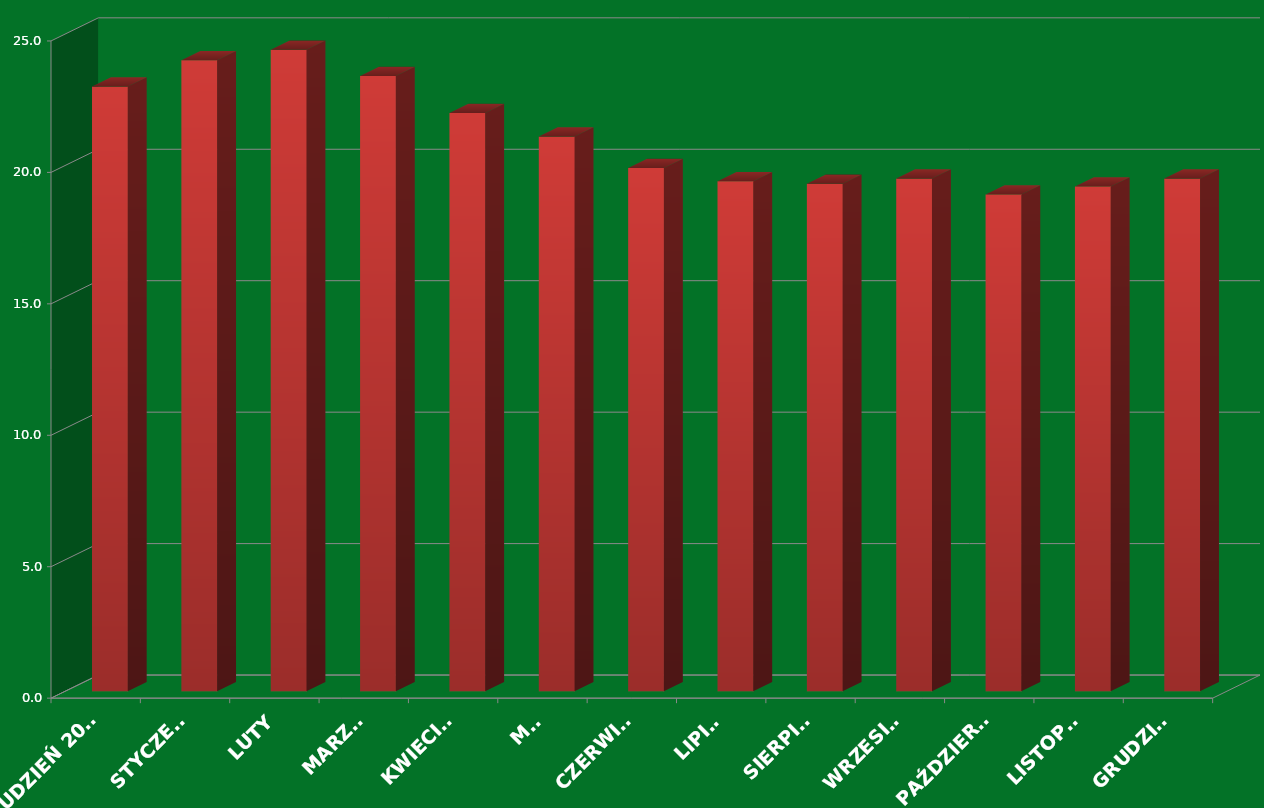
| Category | Series 0 |
|---|---|
| GRUDZIEŃ 2013 | 23 |
| STYCZEŃ | 24 |
| LUTY | 24.4 |
| MARZEC | 23.4 |
| KWIECIEŃ | 22 |
| MAJ | 21.1 |
| CZERWIEC | 19.9 |
| LIPIEC | 19.4 |
| SIERPIEŃ | 19.3 |
| WRZESIEŃ | 19.5 |
| PAŹDZIERNIK | 18.9 |
| LISTOPAD | 19.2 |
| GRUDZIEŃ | 19.5 |